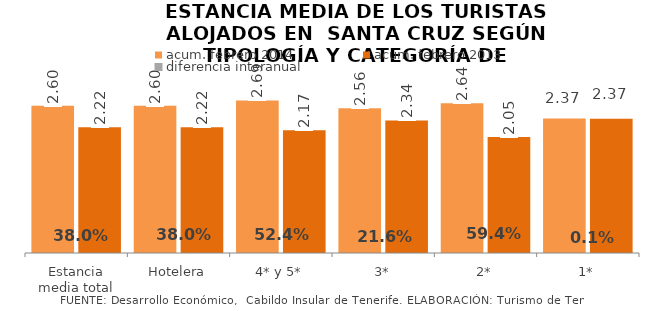
| Category | acum. febrero 2014 | acum. febrero 2013 |
|---|---|---|
| Estancia media total | 2.6 | 2.22 |
| Hotelera | 2.6 | 2.22 |
| 4* y 5* | 2.691 | 2.168 |
| 3* | 2.557 | 2.34 |
| 2* | 2.641 | 2.047 |
| 1* | 2.373 | 2.371 |